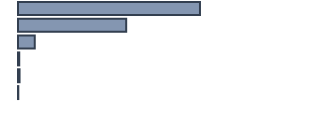
| Category | Series 0 |
|---|---|
| 0 | 58.7 |
| 1 | 34.9 |
| 2 | 5.4 |
| 3 | 0.4 |
| 4 | 0.5 |
| 5 | 0.1 |